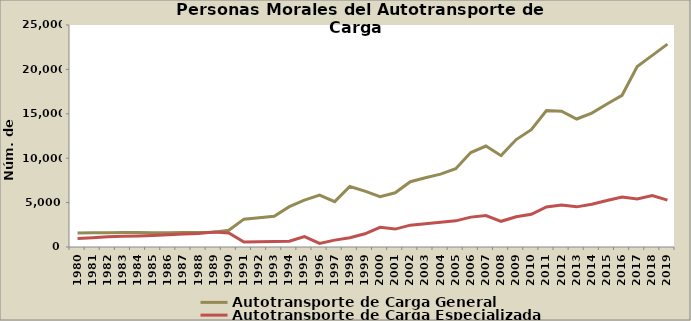
| Category | Autotransporte de Carga General | Autotransporte de Carga Especializada |
|---|---|---|
| 1980.0 | 1569 | 949 |
| 1981.0 | 1596 | 1046 |
| 1982.0 | 1602 | 1150 |
| 1983.0 | 1627 | 1200 |
| 1984.0 | 1626 | 1239 |
| 1985.0 | 1606 | 1289 |
| 1986.0 | 1609 | 1366 |
| 1987.0 | 1631 | 1456 |
| 1988.0 | 1633 | 1516 |
| 1989.0 | 1662 | 1675 |
| 1990.0 | 1892 | 1590 |
| 1991.0 | 3137 | 563 |
| 1992.0 | 3290 | 590 |
| 1993.0 | 3459 | 617 |
| 1994.0 | 4545 | 642 |
| 1995.0 | 5278 | 1171 |
| 1996.0 | 5841 | 398 |
| 1997.0 | 5107 | 776 |
| 1998.0 | 6812 | 1052 |
| 1999.0 | 6297 | 1486 |
| 2000.0 | 5669 | 2211 |
| 2001.0 | 6101 | 2017 |
| 2002.0 | 7351 | 2459 |
| 2003.0 | 7805 | 2627 |
| 2004.0 | 8202 | 2776 |
| 2005.0 | 8815 | 2943 |
| 2006.0 | 10632 | 3366 |
| 2007.0 | 11373 | 3550 |
| 2008.0 | 10287 | 2894 |
| 2009.0 | 12098 | 3412 |
| 2010.0 | 13210 | 3682 |
| 2011.0 | 15370 | 4517 |
| 2012.0 | 15298 | 4716 |
| 2013.0 | 14416 | 4521 |
| 2014.0 | 15084 | 4819 |
| 2015.0 | 16109 | 5228 |
| 2016.0 | 17082 | 5622 |
| 2017.0 | 20319 | 5401 |
| 2018.0 | 21582 | 5792 |
| 2019.0 | 22849 | 5272 |